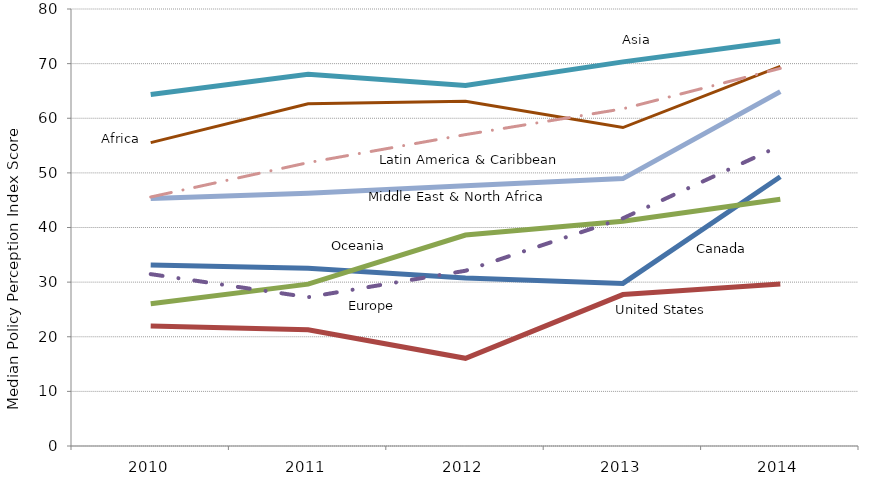
| Category |   Canada |   United States |   Oceania |   Europe |   Asia |   Africa |   Middle East and North Africa |   Latin American and Caribbean |
|---|---|---|---|---|---|---|---|---|
| 2010.0 | 33.156 | 21.956 | 26.055 | 31.465 | 64.33 | 55.537 | 45.32 | 45.583 |
| 2011.0 | 32.535 | 21.28 | 29.632 | 27.243 | 68.061 | 62.658 | 46.248 | 51.877 |
| 2012.0 | 30.757 | 16.056 | 38.618 | 32.083 | 65.982 | 63.122 | 47.661 | 57.005 |
| 2013.0 | 29.759 | 27.721 | 41.145 | 41.686 | 70.319 | 58.295 | 48.948 | 61.727 |
| 2014.0 | 49.28 | 29.658 | 45.154 | 54.974 | 74.15 | 69.507 | 64.871 | 69.13 |